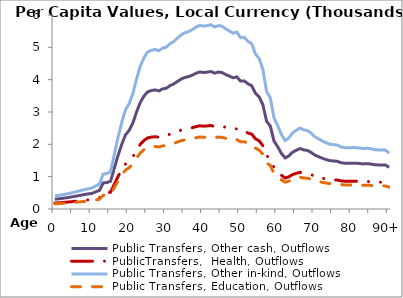
| Category | Public Transfers, Other cash, Outflows | PublicTransfers,  Health, Outflows | Public Transfers, Other in-kind, Outflows | Public Transfers, Education, Outflows |
|---|---|---|---|---|
| 0 | 301.247 | 182.858 | 403.63 | 158.224 |
|  | 315.601 | 191.571 | 422.862 | 165.763 |
| 2 | 329.243 | 199.852 | 441.141 | 172.929 |
| 3 | 344.833 | 209.315 | 462.028 | 181.116 |
| 4 | 361.749 | 219.583 | 484.694 | 190.001 |
| 5 | 383.375 | 232.711 | 513.671 | 201.36 |
| 6 | 404.389 | 245.466 | 541.826 | 212.397 |
| 7 | 425.924 | 258.538 | 570.68 | 223.708 |
| 8 | 447.778 | 271.804 | 599.961 | 235.186 |
| 9 | 467.146 | 283.56 | 625.912 | 245.359 |
| 10 | 482.481 | 292.868 | 646.458 | 253.413 |
| 11 | 532.14 | 323.012 | 712.995 | 279.496 |
| 12 | 573.319 | 348.008 | 768.17 | 301.125 |
| 13 | 804.09 | 488.086 | 1077.37 | 422.332 |
| 14 | 818.263 | 496.69 | 1096.36 | 429.776 |
| 15 | 859.246 | 521.566 | 1151.272 | 451.302 |
| 16 | 1258.697 | 764.035 | 1686.482 | 661.105 |
| 17 | 1651.48 | 1002.457 | 2212.758 | 867.407 |
| 18 | 1997.465 | 1212.472 | 2676.331 | 1049.129 |
| 19 | 2287.629 | 1388.602 | 3065.11 | 1201.531 |
| 20 | 2432.903 | 1476.784 | 3259.758 | 1277.834 |
| 21 | 2661.839 | 1615.749 | 3566.5 | 1398.078 |
| 22 | 3002.36 | 1822.448 | 4022.752 | 1576.93 |
| 23 | 3296.34 | 2000.895 | 4416.646 | 1731.337 |
| 24 | 3494.7 | 2121.301 | 4682.421 | 1835.521 |
| 25 | 3624.207 | 2199.912 | 4855.942 | 1903.542 |
| 26 | 3663.62 | 2223.836 | 4908.75 | 1924.243 |
| 27 | 3682.319 | 2235.186 | 4933.805 | 1934.065 |
| 28 | 3653.54 | 2217.717 | 4895.245 | 1918.949 |
| 29 | 3714.191 | 2254.533 | 4976.509 | 1950.805 |
| 30 | 3734.079 | 2266.605 | 5003.156 | 1961.25 |
| 31 | 3815.758 | 2316.184 | 5112.595 | 2004.151 |
| 32 | 3866.17 | 2346.784 | 5180.139 | 2030.628 |
| 33 | 3945.667 | 2395.04 | 5286.655 | 2072.383 |
| 34 | 4018.972 | 2439.537 | 5384.874 | 2110.885 |
| 35 | 4067.458 | 2468.968 | 5449.839 | 2136.351 |
| 36 | 4094.696 | 2485.501 | 5486.333 | 2150.657 |
| 37 | 4140.915 | 2513.556 | 5548.26 | 2174.933 |
| 38 | 4198.01 | 2548.213 | 5624.761 | 2204.921 |
| 39 | 4239.177 | 2573.202 | 5679.919 | 2226.543 |
| 40 | 4221.32 | 2562.362 | 5655.992 | 2217.164 |
| 41 | 4232.339 | 2569.051 | 5670.757 | 2222.952 |
| 42 | 4254.537 | 2582.526 | 5700.499 | 2234.611 |
| 43 | 4202.436 | 2550.9 | 5630.69 | 2207.246 |
| 44 | 4233.606 | 2569.82 | 5672.454 | 2223.617 |
| 45 | 4219.925 | 2561.516 | 5654.123 | 2216.431 |
| 46 | 4158.508 | 2524.236 | 5571.834 | 2184.174 |
| 47 | 4109.243 | 2494.331 | 5505.824 | 2158.298 |
| 48 | 4057.653 | 2463.016 | 5436.701 | 2131.201 |
| 49 | 4086.818 | 2480.719 | 5475.779 | 2146.52 |
| 50 | 3955.468 | 2400.989 | 5299.787 | 2077.531 |
| 51 | 3961.54 | 2404.675 | 5307.923 | 2080.72 |
| 52 | 3870.611 | 2349.481 | 5186.091 | 2032.961 |
| 53 | 3813.458 | 2314.788 | 5109.513 | 2002.943 |
| 54 | 3580.84 | 2173.588 | 4797.837 | 1880.765 |
| 55 | 3469.769 | 2106.167 | 4649.017 | 1822.427 |
| 56 | 3225.932 | 1958.157 | 4322.309 | 1694.356 |
| 57 | 2714.445 | 1647.682 | 3636.986 | 1425.708 |
| 58 | 2566.505 | 1557.882 | 3438.766 | 1348.006 |
| 59 | 2101.825 | 1275.819 | 2816.159 | 1103.942 |
| 60 | 1924.312 | 1168.067 | 2578.316 | 1010.707 |
| 61 | 1717.733 | 1042.672 | 2301.527 | 902.205 |
| 62 | 1580.468 | 959.352 | 2117.611 | 830.109 |
| 63 | 1641.58 | 996.447 | 2199.493 | 862.207 |
| 64 | 1755.277 | 1065.462 | 2351.831 | 921.924 |
| 65 | 1816.467 | 1102.605 | 2433.818 | 954.063 |
| 66 | 1870.393 | 1135.338 | 2506.071 | 982.386 |
| 67 | 1827.618 | 1109.374 | 2448.759 | 959.92 |
| 68 | 1812.094 | 1099.95 | 2427.959 | 951.766 |
| 69 | 1748.595 | 1061.406 | 2342.878 | 918.414 |
| 70 | 1667.719 | 1012.314 | 2234.515 | 875.936 |
| 71 | 1618.733 | 982.579 | 2168.882 | 850.207 |
| 72 | 1569.3 | 952.573 | 2102.648 | 824.244 |
| 73 | 1530.862 | 929.241 | 2051.147 | 804.055 |
| 74 | 1496.812 | 908.572 | 2005.523 | 786.171 |
| 75 | 1485.127 | 901.479 | 1989.867 | 780.033 |
| 76 | 1476.607 | 896.308 | 1978.452 | 775.558 |
| 77 | 1433.411 | 870.087 | 1920.574 | 752.87 |
| 78 | 1416.594 | 859.88 | 1898.043 | 744.038 |
| 79 | 1414.587 | 858.662 | 1895.354 | 742.984 |
| 80 | 1417.077 | 860.173 | 1898.69 | 744.291 |
| 81 | 1417.785 | 860.603 | 1899.639 | 744.663 |
| 82 | 1407.955 | 854.636 | 1886.468 | 739.5 |
| 83 | 1394.352 | 846.379 | 1868.241 | 732.356 |
| 84 | 1402.194 | 851.139 | 1878.749 | 736.475 |
| 85 | 1393.185 | 845.671 | 1866.678 | 731.743 |
| 86 | 1369.769 | 831.457 | 1835.304 | 719.444 |
| 87 | 1363.915 | 827.903 | 1827.46 | 716.369 |
| 88 | 1364.543 | 828.285 | 1828.302 | 716.699 |
| 89 | 1359.698 | 825.344 | 1821.81 | 714.154 |
| 90+ | 1289.92 | 782.988 | 1728.317 | 677.505 |